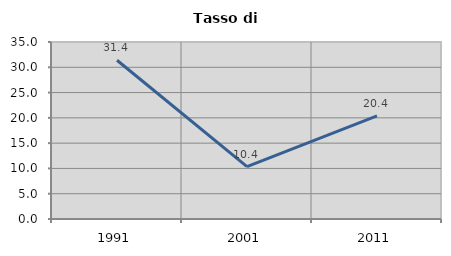
| Category | Tasso di disoccupazione   |
|---|---|
| 1991.0 | 31.393 |
| 2001.0 | 10.366 |
| 2011.0 | 20.408 |